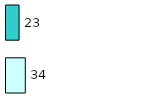
| Category | Series 0 | Series 1 |
|---|---|---|
| 0 | 34 | 23 |